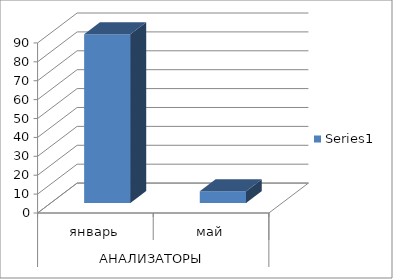
| Category | Series 0 |
|---|---|
| 0 | 89.286 |
| 1 | 6.2 |